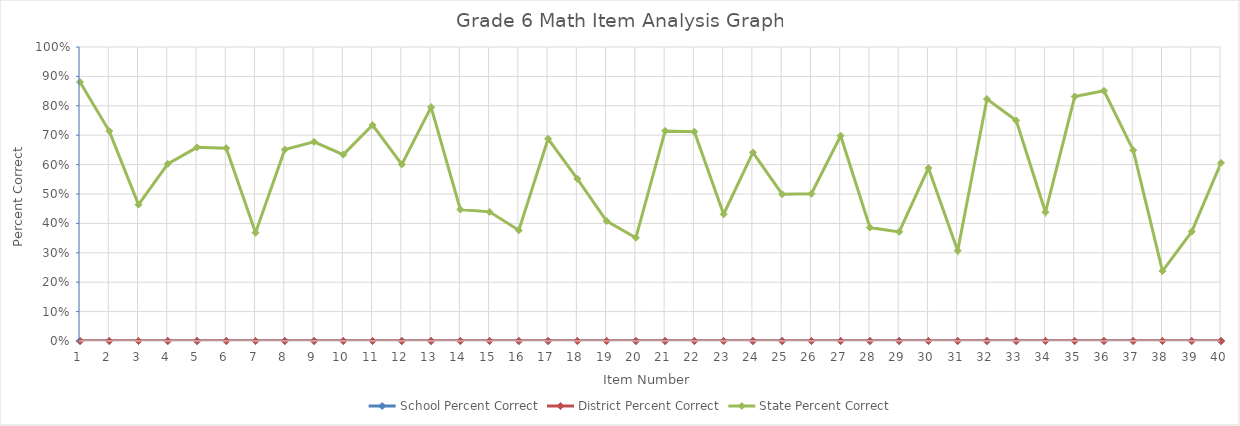
| Category | School Percent Correct | District Percent Correct | State Percent Correct |
|---|---|---|---|
| 1.0 | 0 | 0 | 0.881 |
| 2.0 | 0 | 0 | 0.714 |
| 3.0 | 0 | 0 | 0.464 |
| 4.0 | 0 | 0 | 0.602 |
| 5.0 | 0 | 0 | 0.659 |
| 6.0 | 0 | 0 | 0.656 |
| 7.0 | 0 | 0 | 0.368 |
| 8.0 | 0 | 0 | 0.651 |
| 9.0 | 0 | 0 | 0.678 |
| 10.0 | 0 | 0 | 0.634 |
| 11.0 | 0 | 0 | 0.734 |
| 12.0 | 0 | 0 | 0.601 |
| 13.0 | 0 | 0 | 0.795 |
| 14.0 | 0 | 0 | 0.447 |
| 15.0 | 0 | 0 | 0.439 |
| 16.0 | 0 | 0 | 0.377 |
| 17.0 | 0 | 0 | 0.688 |
| 18.0 | 0 | 0 | 0.552 |
| 19.0 | 0 | 0 | 0.408 |
| 20.0 | 0 | 0 | 0.351 |
| 21.0 | 0 | 0 | 0.715 |
| 22.0 | 0 | 0 | 0.712 |
| 23.0 | 0 | 0 | 0.431 |
| 24.0 | 0 | 0 | 0.642 |
| 25.0 | 0 | 0 | 0.499 |
| 26.0 | 0 | 0 | 0.501 |
| 27.0 | 0 | 0 | 0.698 |
| 28.0 | 0 | 0 | 0.386 |
| 29.0 | 0 | 0 | 0.371 |
| 30.0 | 0 | 0 | 0.588 |
| 31.0 | 0 | 0 | 0.307 |
| 32.0 | 0 | 0 | 0.823 |
| 33.0 | 0 | 0 | 0.75 |
| 34.0 | 0 | 0 | 0.438 |
| 35.0 | 0 | 0 | 0.832 |
| 36.0 | 0 | 0 | 0.851 |
| 37.0 | 0 | 0 | 0.649 |
| 38.0 | 0 | 0 | 0.238 |
| 39.0 | 0 | 0 | 0.372 |
| 40.0 | 0 | 0 | 0.606 |